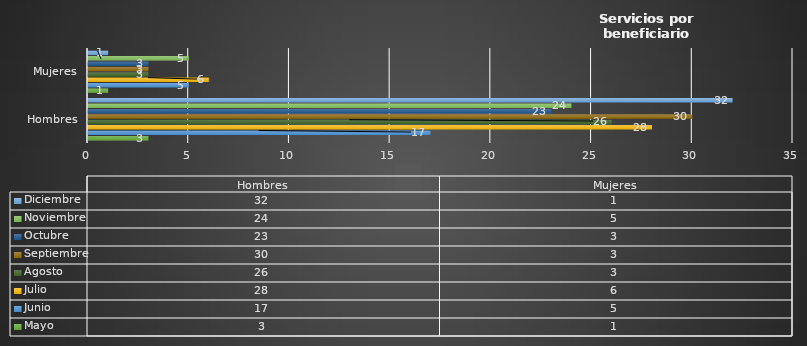
| Category | Mayo  | Junio | Julio | Agosto | Septiembre | Octubre | Noviembre | Diciembre |
|---|---|---|---|---|---|---|---|---|
| Hombres | 3 | 17 | 28 | 26 | 30 | 23 | 24 | 32 |
| Mujeres | 1 | 5 | 6 | 3 | 3 | 3 | 5 | 1 |